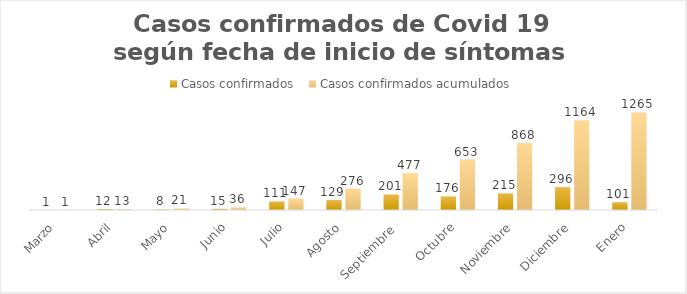
| Category | Casos confirmados  | Casos confirmados acumulados |
|---|---|---|
| Marzo | 1 | 1 |
| Abril | 12 | 13 |
| Mayo | 8 | 21 |
| Junio | 15 | 36 |
| Julio | 111 | 147 |
| Agosto | 129 | 276 |
| Septiembre  | 201 | 477 |
| Octubre | 176 | 653 |
| Noviembre | 215 | 868 |
| Diciembre | 296 | 1164 |
| Enero | 101 | 1265 |